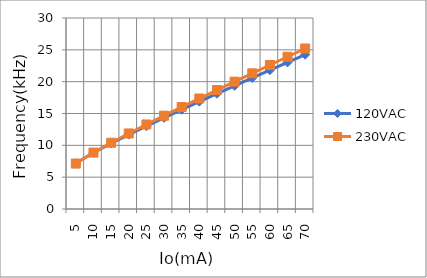
| Category | 120VAC | 230VAC |
|---|---|---|
| 5.0 | 7.177 | 7.134 |
| 10.0 | 8.828 | 8.86 |
| 15.0 | 10.298 | 10.405 |
| 20.0 | 11.683 | 11.866 |
| 25.0 | 13.018 | 13.277 |
| 30.0 | 14.32 | 14.657 |
| 35.0 | 15.599 | 16.014 |
| 40.0 | 16.861 | 17.354 |
| 45.0 | 18.111 | 18.683 |
| 50.0 | 19.35 | 20.001 |
| 55.0 | 20.581 | 21.312 |
| 60.0 | 21.806 | 22.616 |
| 65.0 | 23.025 | 23.915 |
| 70.0 | 24.239 | 25.21 |